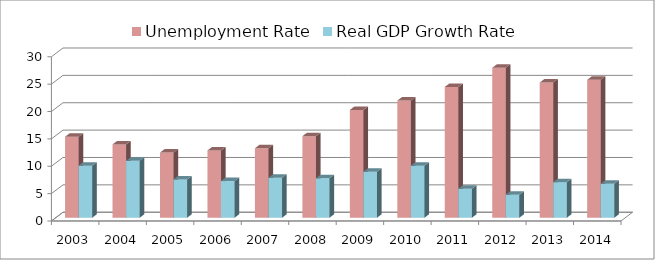
| Category | Unemployment Rate | Real GDP Growth Rate |
|---|---|---|
| 2003 | 14.8 | 9.5 |
| 2004 | 13.4 | 10.4 |
| 2005 | 11.9 | 7 |
| 2006 | 12.3 | 6.7 |
| 2007 | 12.7 | 7.3 |
| 2008 | 14.9 | 7.2 |
| 2009 | 19.7 | 8.4 |
| 2010 | 21.4 | 9.5 |
| 2011 | 23.9 | 5.3 |
| 2012 | 27.4 | 4.2 |
| 2013 | 24.7 | 6.5 |
| 2014 | 25.2 | 6.2 |